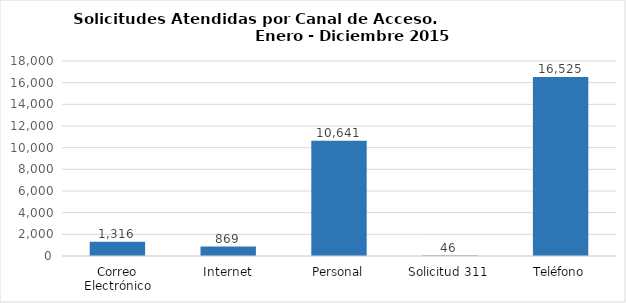
| Category | Total |
|---|---|
| Correo Electrónico | 1316 |
| Internet | 869 |
| Personal | 10641 |
| Solicitud 311 | 46 |
| Teléfono | 16525 |